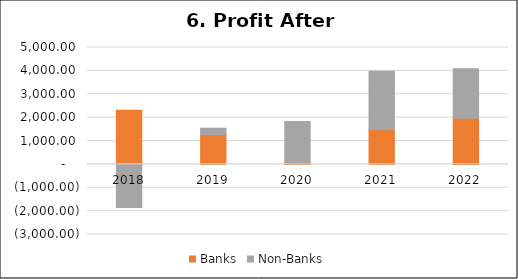
| Category |  Banks  |  Non-Banks  |
|---|---|---|
| 2018.0 | 2314.648 | -1839.873 |
| 2019.0 | 1276.592 | 270.579 |
| 2020.0 | 80.106 | 1752.433 |
| 2021.0 | 1479.639 | 2508.404 |
| 2022.0 | 1976.641 | 2114.935 |